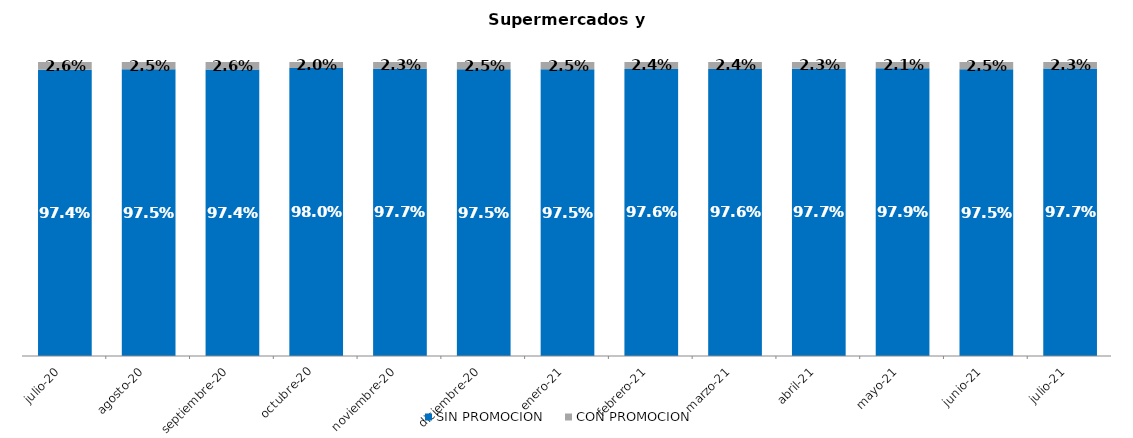
| Category | SIN PROMOCION   | CON PROMOCION   |
|---|---|---|
| 2020-07-01 | 0.974 | 0.026 |
| 2020-08-01 | 0.975 | 0.025 |
| 2020-09-01 | 0.974 | 0.026 |
| 2020-10-01 | 0.98 | 0.02 |
| 2020-11-01 | 0.977 | 0.023 |
| 2020-12-01 | 0.975 | 0.025 |
| 2021-01-01 | 0.975 | 0.025 |
| 2021-02-01 | 0.976 | 0.024 |
| 2021-03-01 | 0.976 | 0.024 |
| 2021-04-01 | 0.977 | 0.023 |
| 2021-05-01 | 0.979 | 0.021 |
| 2021-06-01 | 0.975 | 0.025 |
| 2021-07-01 | 0.977 | 0.023 |